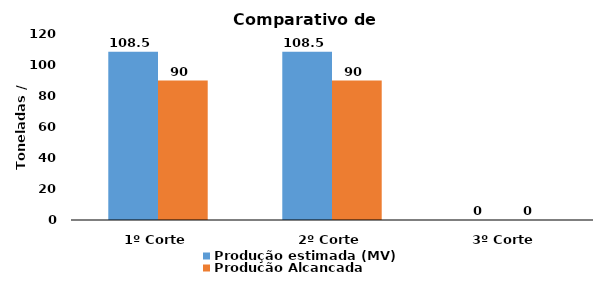
| Category | Produção estimada (MV) | Produção Alcançada |
|---|---|---|
| 1º Corte | 108.5 | 90 |
| 2º Corte | 108.5 | 90 |
| 3º Corte | 0 | 0 |